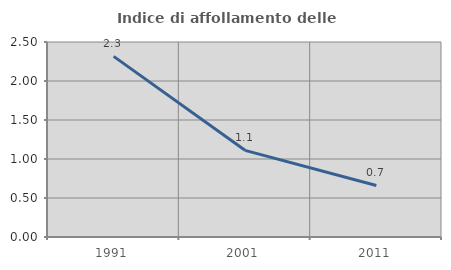
| Category | Indice di affollamento delle abitazioni  |
|---|---|
| 1991.0 | 2.316 |
| 2001.0 | 1.111 |
| 2011.0 | 0.661 |